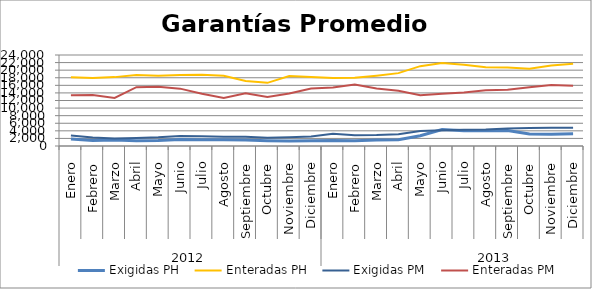
| Category | Exigidas PH | Enteradas PH | Exigidas PM | Enteradas PM |
|---|---|---|---|---|
| 0 | 1828.564 | 18155.583 | 2744.93 | 13413.991 |
| 1 | 1451.155 | 17917.734 | 2215.902 | 13440.832 |
| 2 | 1587.31 | 18166.129 | 1968.766 | 12673.714 |
| 3 | 1353.003 | 18741.256 | 2118.782 | 15515.723 |
| 4 | 1464.668 | 18540.927 | 2278.002 | 15625.393 |
| 5 | 1719.43 | 18734.539 | 2626.915 | 15127.903 |
| 6 | 1674.023 | 18761.463 | 2556.575 | 13766.49 |
| 7 | 1647.243 | 18544.546 | 2463.76 | 12637.427 |
| 8 | 1556.152 | 17124.972 | 2459.803 | 13929.715 |
| 9 | 1402.926 | 16653.067 | 2169.047 | 12937.81 |
| 10 | 1329.011 | 18467.462 | 2322.009 | 13825.53 |
| 11 | 1379.519 | 18204.98 | 2522.413 | 15188.776 |
| 12 | 1462.675 | 17957.148 | 3246.817 | 15415.235 |
| 13 | 1398.609 | 17993.637 | 2845.352 | 16230.589 |
| 14 | 1589.589 | 18548.479 | 2894.834 | 15192.36 |
| 15 | 1623.519 | 19220.98 | 3086.854 | 14555.102 |
| 16 | 2700.009 | 21053.59 | 3968.296 | 13386.678 |
| 17 | 4335.591 | 21872.028 | 4126.324 | 13759.513 |
| 18 | 4053.78 | 21401.693 | 4283.155 | 14110.316 |
| 19 | 4016.859 | 20783.858 | 4341.698 | 14691.614 |
| 20 | 4109.679 | 20689.944 | 4647.813 | 14857.936 |
| 21 | 3158.931 | 20386.396 | 4756.737 | 15467.175 |
| 22 | 3080.721 | 21200.312 | 4793.633 | 16095.042 |
| 23 | 3249.796 | 21689.961 | 4829.499 | 15921.902 |